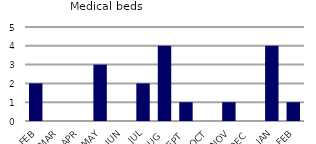
| Category | Medical beds |
|---|---|
| FEB | 2 |
| MAR | 0 |
| APR | 0 |
| MAY | 3 |
| JUN | 0 |
| JUL | 2 |
| AUG | 4 |
| SEPT | 1 |
| OCT | 0 |
| NOV | 1 |
| DEC | 0 |
| JAN | 4 |
| FEB | 1 |